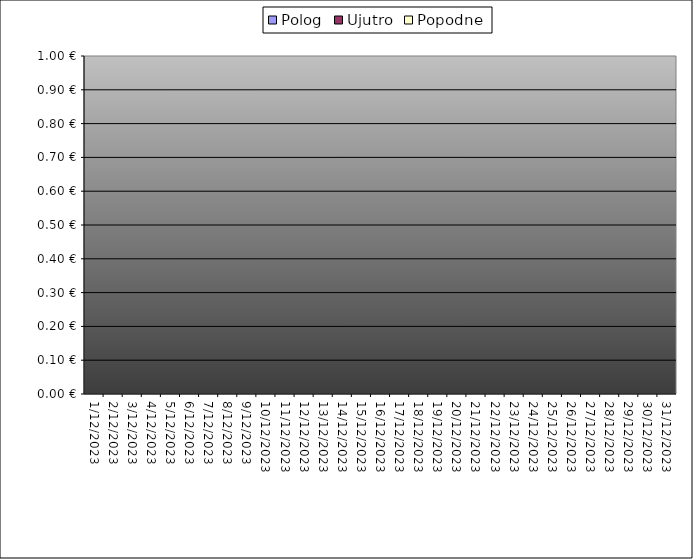
| Category | Polog | Ujutro | Popodne |
|---|---|---|---|
| 2023-12-01 |  | 0 | 0 |
| 2023-12-02 |  | 0 | 0 |
| 2023-12-03 |  | 0 | 0 |
| 2023-12-04 |  | 0 | 0 |
| 2023-12-05 |  | 0 | 0 |
| 2023-12-06 |  | 0 | 0 |
| 2023-12-07 |  | 0 | 0 |
| 2023-12-08 |  | 0 | 0 |
| 2023-12-09 |  | 0 | 0 |
| 2023-12-10 |  | 0 | 0 |
| 2023-12-11 |  | 0 | 0 |
| 2023-12-12 |  | 0 | 0 |
| 2023-12-13 |  | 0 | 0 |
| 2023-12-14 |  | 0 | 0 |
| 2023-12-15 |  | 0 | 0 |
| 2023-12-16 |  | 0 | 0 |
| 2023-12-17 |  | 0 | 0 |
| 2023-12-18 |  | 0 | 0 |
| 2023-12-19 |  | 0 | 0 |
| 2023-12-20 |  | 0 | 0 |
| 2023-12-21 |  | 0 | 0 |
| 2023-12-22 |  | 0 | 0 |
| 2023-12-23 |  | 0 | 0 |
| 2023-12-24 |  | 0 | 0 |
| 2023-12-25 |  | 0 | 0 |
| 2023-12-26 |  | 0 | 0 |
| 2023-12-27 |  | 0 | 0 |
| 2023-12-28 |  | 0 | 0 |
| 2023-12-29 |  | 0 | 0 |
| 2023-12-30 |  | 0 | 0 |
| 2023-12-31 |  | 0 | 0 |